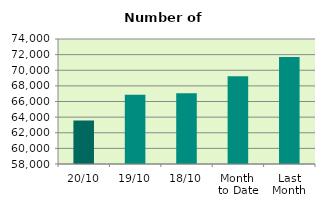
| Category | Series 0 |
|---|---|
| 20/10 | 63570 |
| 19/10 | 66860 |
| 18/10 | 67046 |
| Month 
to Date | 69217.714 |
| Last
Month | 71692 |